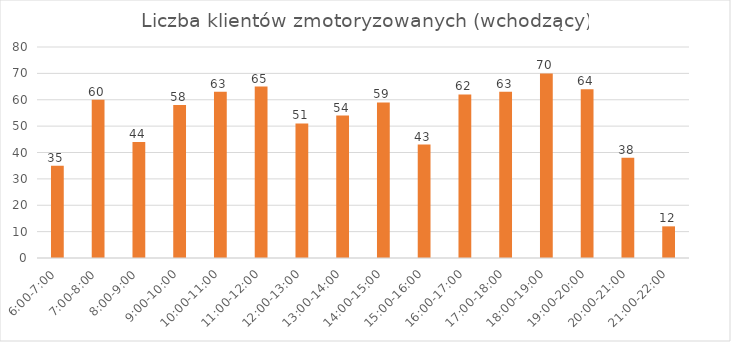
| Category | os/godz |
|---|---|
| 6:00-7:00 | 35 |
| 7:00-8:00 | 60 |
| 8:00-9:00 | 44 |
| 9:00-10:00 | 58 |
| 10:00-11:00 | 63 |
| 11:00-12:00 | 65 |
| 12:00-13:00 | 51 |
| 13:00-14:00 | 54 |
| 14:00-15:00 | 59 |
| 15:00-16:00 | 43 |
| 16:00-17:00 | 62 |
| 17:00-18:00 | 63 |
| 18:00-19:00 | 70 |
| 19:00-20:00 | 64 |
| 20:00-21:00 | 38 |
| 21:00-22:00 | 12 |